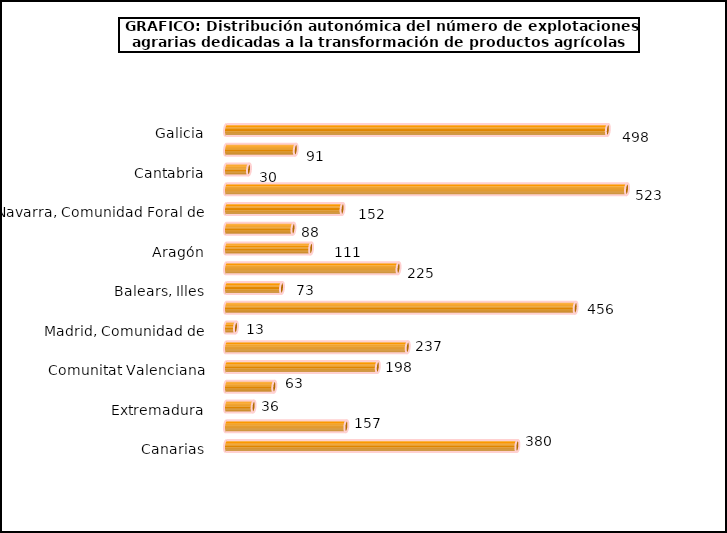
| Category | num. Explotaciones |
|---|---|
| Galicia | 498 |
| Asturias, Principado de | 91 |
| Cantabria | 30 |
| País Vasco | 523 |
| Navarra, Comunidad Foral de | 152 |
| Rioja, La | 88 |
| Aragón | 111 |
| Cataluña | 225 |
| Balears, Illes | 73 |
| Castilla y León | 456 |
| Madrid, Comunidad de | 13 |
| Castilla - La Mancha | 237 |
| Comunitat Valenciana | 198 |
| Murcia, Región de | 63 |
| Extremadura | 36 |
| Andalucía | 157 |
| Canarias | 380 |